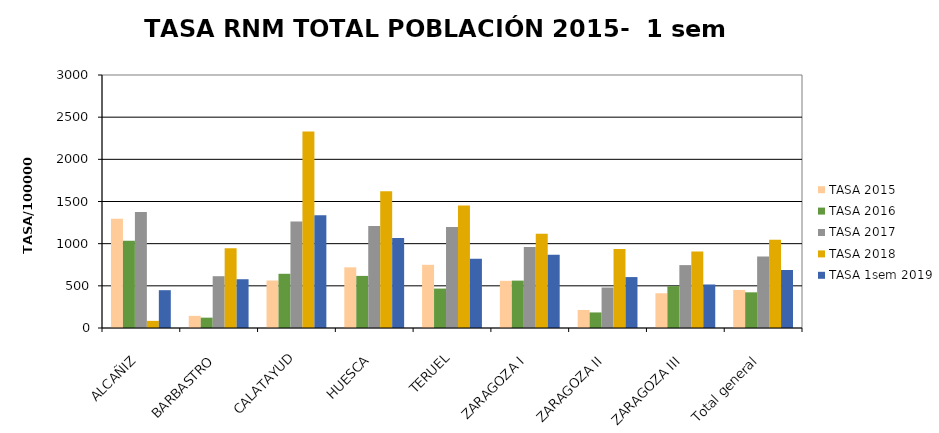
| Category | TASA 2015 | TASA 2016 | TASA 2017 | TASA 2018 | TASA 1sem 2019 |
|---|---|---|---|---|---|
| ALCAÑIZ | 1294.43 |  | 1376.784 | 84.741 | 448.398 |
| BARBASTRO | 143.901 |  | 614.221 | 945.264 | 578.206 |
| CALATAYUD | 563.034 |  | 1262.665 | 2329.573 | 1335.552 |
| HUESCA | 719.546 |  | 1208.369 | 1621.969 | 1067.891 |
| TERUEL | 749.19 |  | 1196.401 | 1452.692 | 822.534 |
| ZARAGOZA I | 559.186 |  | 961.729 | 1116.731 | 868.277 |
| ZARAGOZA II | 213.85 |  | 480.095 | 936.014 | 603.912 |
| ZARAGOZA III | 412.159 |  | 745.869 | 906.359 | 515.975 |
| Total general | 451.102 |  | 846.755 | 1045.023 | 688.04 |